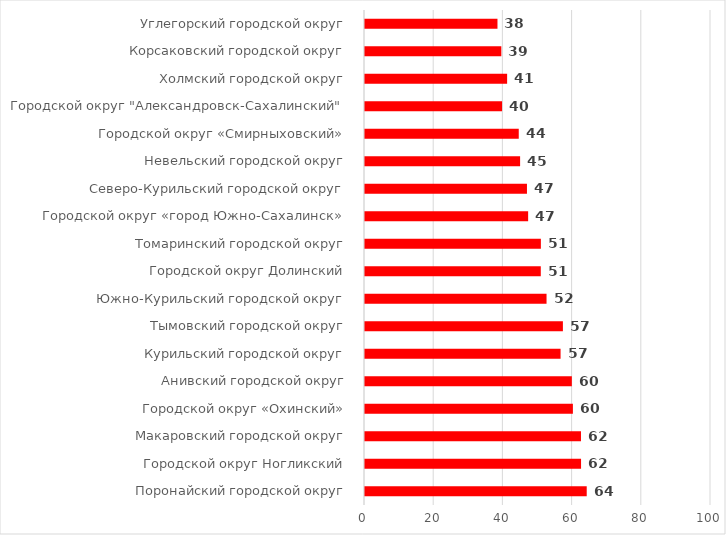
| Category | Series 0 |
|---|---|
| Поронайский городской округ | 64.081 |
| Городской округ Ногликский | 62.443 |
| Макаровский городской округ | 62.421 |
| Городской округ «Охинский» | 60.085 |
| Анивский городской округ | 59.779 |
| Курильский городской округ | 56.523 |
| Тымовский городской округ | 57.197 |
| Южно-Курильский городской округ | 52.47 |
| Городской округ Долинский | 50.805 |
| Томаринский городской округ | 50.83 |
| Городской округ «город Южно-Сахалинск» | 47.151 |
| Северо-Курильский городской округ | 46.81 |
| Невельский городской округ | 44.828 |
| Городской округ «Смирныховский» | 44.437 |
| Городской округ "Александровск-Сахалинский" | 39.614 |
| Холмский городской округ | 41.076 |
| Корсаковский городской округ | 39.401 |
| Углегорский городской округ | 38.287 |